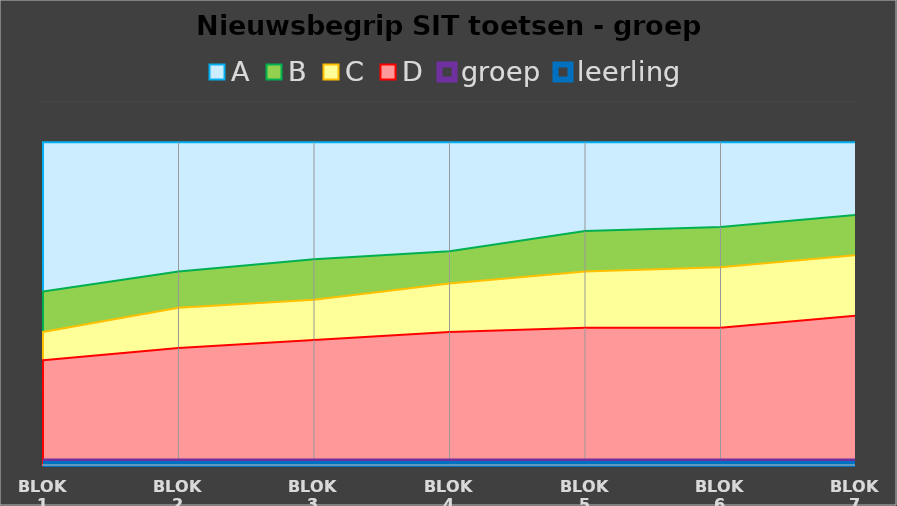
| Category | A | B | C | D | groep | leerling |
|---|---|---|---|---|---|---|
| blok 1 | 40 | 21.5 | 16.5 | 13 | 0 | 0 |
| blok 2 | 40 | 24 | 19.5 | 14.5 | 0 | 0 |
| blok 3 | 40 | 25.5 | 20.5 | 15.5 | 0 | 0 |
| blok 4 | 40 | 26.5 | 22.5 | 16.5 | 0 | 0 |
| blok 5 | 40 | 29 | 24 | 17 | 0 | 0 |
| blok 6 | 40 | 29.5 | 24.5 | 17 | 0 | 0 |
| blok 7 | 40 | 31 | 26 | 18.5 | 0 | 0 |